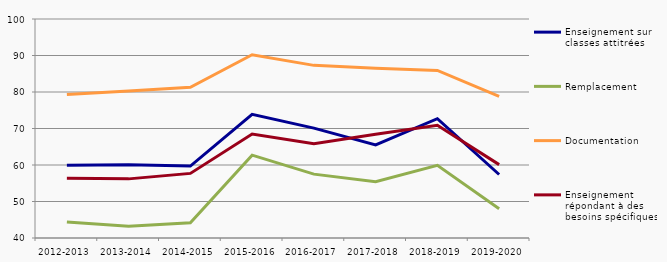
| Category | Enseignement sur classes attitrées | Remplacement | Documentation | Enseignement répondant à des besoins spécifiques |
|---|---|---|---|---|
| 2012-2013 | 59.9 | 44.4 | 79.3 | 56.4 |
| 2013-2014 | 60.1 | 43.2 | 80.3 | 56.2 |
| 2014-2015 | 59.7 | 44.2 | 81.3 | 57.7 |
| 2015-2016 | 73.9 | 62.7 | 90.2 | 68.5 |
| 2016-2017 | 70.1 | 57.5 | 87.3 | 65.8 |
| 2017-2018 | 65.5 | 55.4 | 86.5 | 68.4 |
| 2018-2019 | 72.7 | 59.9 | 85.9 | 70.9 |
| 2019-2020 | 57.4 | 48 | 78.8 | 60.1 |